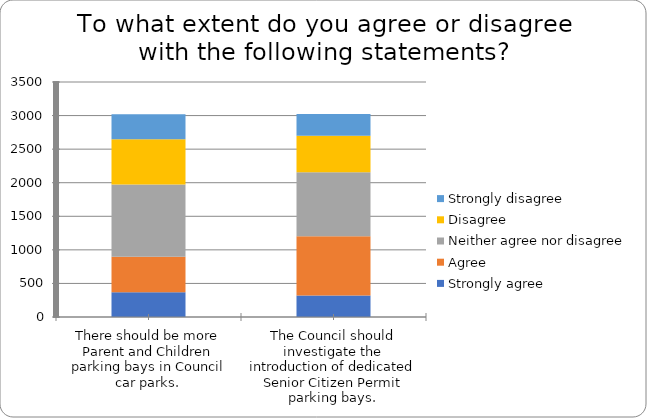
| Category | Strongly agree | Agree | Neither agree nor disagree | Disagree | Strongly disagree |
|---|---|---|---|---|---|
| There should be more Parent and Children parking bays in Council car parks. | 367 | 532 | 1074 | 675 | 372 |
| The Council should investigate the introduction of dedicated Senior Citizen Permit parking bays. | 320 | 882 | 952 | 546 | 322 |